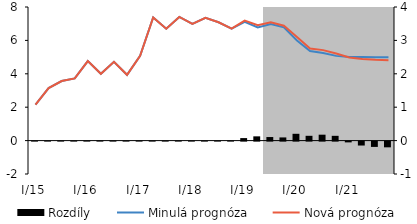
| Category | Rozdíly |
|---|---|
| I/15 | 0 |
| II | 0 |
| III | 0 |
| IV | 0 |
| I/16 | 0 |
| II | 0 |
| III | 0 |
| IV | 0 |
| I/17 | 0 |
| II | 0 |
| III | 0 |
| IV | 0 |
| I/18 | 0 |
| II | 0 |
| III | 0 |
| IV | 0 |
| I/19 | 0.075 |
| II | 0.127 |
| III | 0.107 |
| IV | 0.095 |
| I/20 | 0.204 |
| II | 0.144 |
| III | 0.177 |
| IV | 0.143 |
| I/21 | -0.023 |
| II | -0.118 |
| III | -0.159 |
| IV | -0.172 |